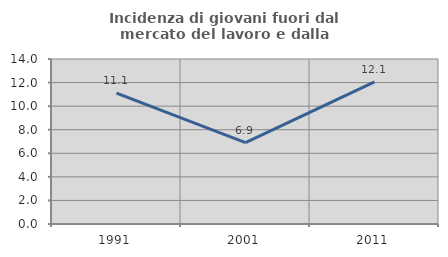
| Category | Incidenza di giovani fuori dal mercato del lavoro e dalla formazione  |
|---|---|
| 1991.0 | 11.111 |
| 2001.0 | 6.897 |
| 2011.0 | 12.057 |